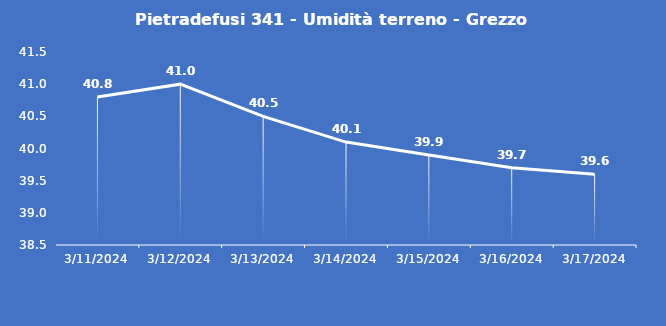
| Category | Pietradefusi 341 - Umidità terreno - Grezzo (%VWC) |
|---|---|
| 3/11/24 | 40.8 |
| 3/12/24 | 41 |
| 3/13/24 | 40.5 |
| 3/14/24 | 40.1 |
| 3/15/24 | 39.9 |
| 3/16/24 | 39.7 |
| 3/17/24 | 39.6 |